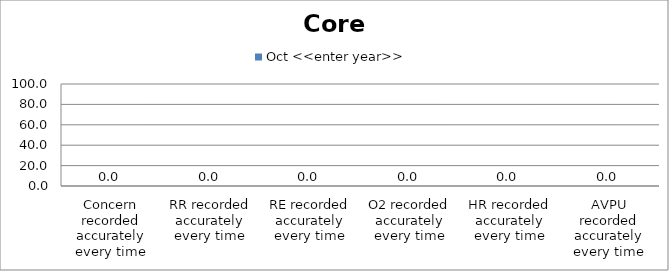
| Category | Oct <<enter year>> |
|---|---|
| Concern recorded accurately every time | 0 |
| RR recorded accurately every time | 0 |
| RE recorded accurately every time | 0 |
| O2 recorded accurately every time | 0 |
| HR recorded accurately every time | 0 |
| AVPU recorded accurately every time | 0 |